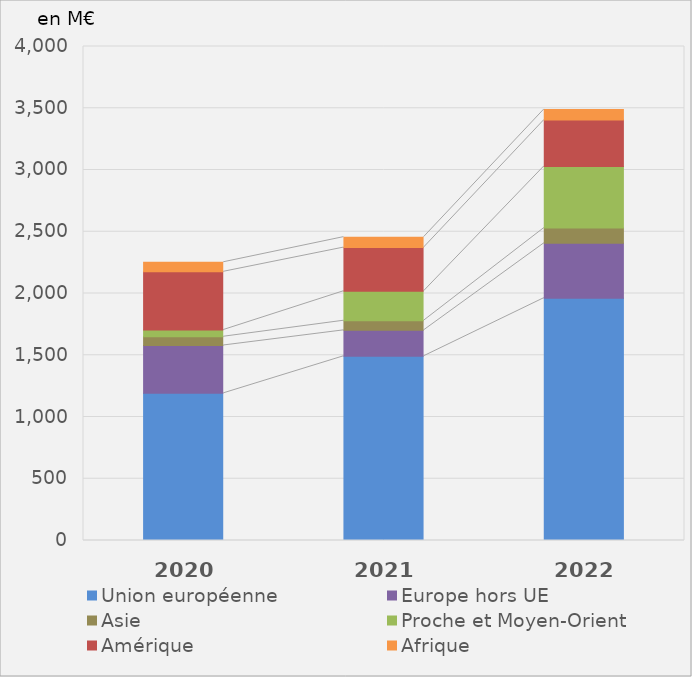
| Category | Union européenne | Europe hors UE | Asie | Proche et Moyen-Orient | Amérique | Afrique |
|---|---|---|---|---|---|---|
| 2020.0 | 1191.3 | 387.7 | 70.9 | 54.3 | 471.5 | 77.2 |
| 2021.0 | 1491.7 | 209.9 | 77.9 | 238.8 | 353.5 | 84.6 |
| 2022.0 | 1962.4 | 444 | 123.4 | 499.4 | 374.7 | 86.3 |